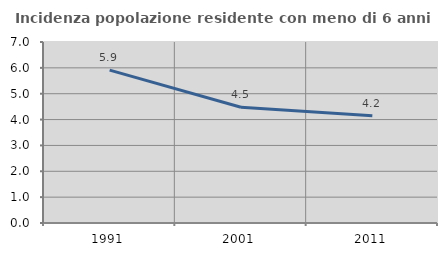
| Category | Incidenza popolazione residente con meno di 6 anni |
|---|---|
| 1991.0 | 5.913 |
| 2001.0 | 4.478 |
| 2011.0 | 4.151 |